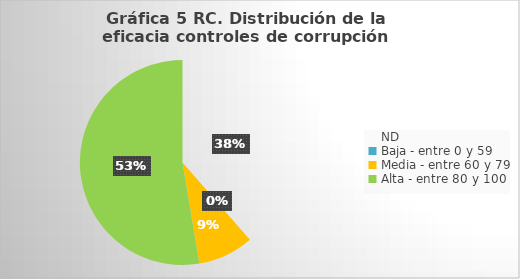
| Category | Series 0 |
|---|---|
| ND | 22 |
| Baja - entre 0 y 59 | 0 |
| Media - entre 60 y 79 | 5 |
| Alta - entre 80 y 100 | 30 |